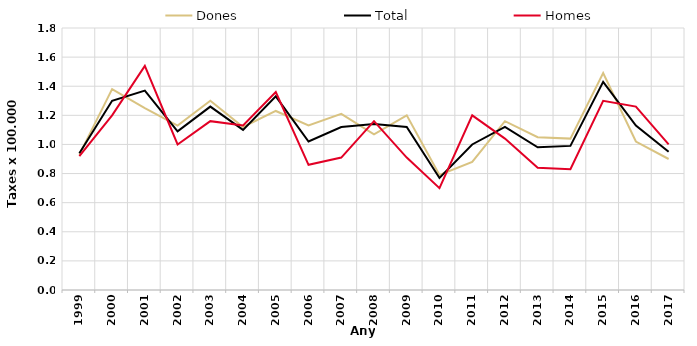
| Category | Dones | Total | Homes |
|---|---|---|---|
| 1999.0 | 0.93 | 0.94 | 0.92 |
| 2000.0 | 1.38 | 1.3 | 1.2 |
| 2001.0 | 1.25 | 1.37 | 1.54 |
| 2002.0 | 1.13 | 1.09 | 1 |
| 2003.0 | 1.3 | 1.26 | 1.16 |
| 2004.0 | 1.12 | 1.1 | 1.13 |
| 2005.0 | 1.23 | 1.33 | 1.36 |
| 2006.0 | 1.13 | 1.02 | 0.86 |
| 2007.0 | 1.21 | 1.12 | 0.91 |
| 2008.0 | 1.07 | 1.14 | 1.16 |
| 2009.0 | 1.2 | 1.12 | 0.91 |
| 2010.0 | 0.79 | 0.77 | 0.7 |
| 2011.0 | 0.88 | 1 | 1.2 |
| 2012.0 | 1.16 | 1.12 | 1.04 |
| 2013.0 | 1.05 | 0.98 | 0.84 |
| 2014.0 | 1.04 | 0.99 | 0.83 |
| 2015.0 | 1.49 | 1.43 | 1.3 |
| 2016.0 | 1.02 | 1.13 | 1.26 |
| 2017.0 | 0.9 | 0.95 | 1 |